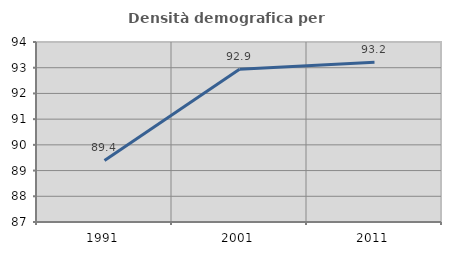
| Category | Densità demografica |
|---|---|
| 1991.0 | 89.395 |
| 2001.0 | 92.945 |
| 2011.0 | 93.209 |